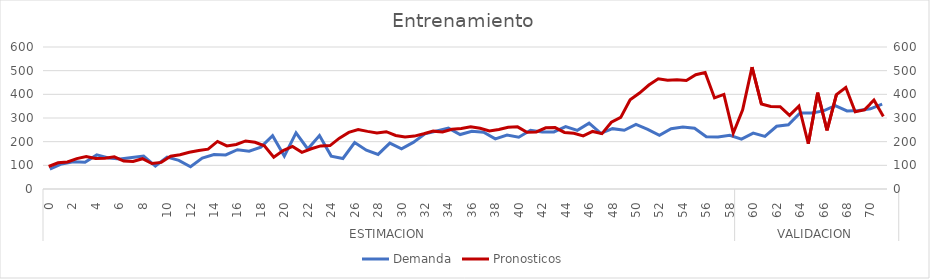
| Category | Demanda |
|---|---|
| 0 | 84 |
| 1 | 106 |
| 2 | 115 |
| 3 | 113 |
| 4 | 144 |
| 5 | 131 |
| 6 | 127 |
| 7 | 133 |
| 8 | 139 |
| 9 | 97 |
| 10 | 135 |
| 11 | 121 |
| 12 | 94 |
| 13 | 131 |
| 14 | 146 |
| 15 | 144 |
| 16 | 166 |
| 17 | 160 |
| 18 | 177 |
| 19 | 225 |
| 20 | 139 |
| 21 | 237 |
| 22 | 169 |
| 23 | 226 |
| 24 | 139 |
| 25 | 129 |
| 26 | 196 |
| 27 | 164 |
| 28 | 146 |
| 29 | 194 |
| 30 | 170 |
| 31 | 197 |
| 32 | 233 |
| 33 | 245 |
| 34 | 257 |
| 35 | 230 |
| 36 | 244 |
| 37 | 240 |
| 38 | 212 |
| 39 | 228 |
| 40 | 219 |
| 41 | 248 |
| 42 | 241 |
| 43 | 241 |
| 44 | 264 |
| 45 | 248 |
| 46 | 278 |
| 47 | 235 |
| 48 | 255 |
| 49 | 248 |
| 50 | 273 |
| 51 | 252 |
| 52 | 227 |
| 53 | 255 |
| 54 | 262 |
| 55 | 257 |
| 56 | 221 |
| 57 | 220 |
| 58 | 227 |
| 59 | 211 |
| 60 | 236 |
| 61 | 222 |
| 62 | 265 |
| 63 | 271 |
| 64 | 321 |
| 65 | 321 |
| 66 | 330 |
| 67 | 352 |
| 68 | 330 |
| 69 | 332 |
| 70 | 339 |
| 71 | 359 |